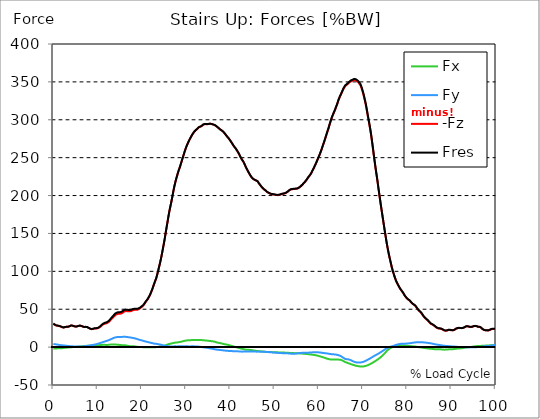
| Category |  Fx |  Fy |  -Fz |  Fres |
|---|---|---|---|---|
| 0.0 | -1.701 | 4.159 | 30.864 | 31.217 |
| 0.167348456675344 | -1.748 | 3.971 | 30.072 | 30.416 |
| 0.334696913350688 | -1.791 | 3.788 | 29.302 | 29.637 |
| 0.5020453700260321 | -1.786 | 3.659 | 28.735 | 29.063 |
| 0.669393826701376 | -1.757 | 3.547 | 28.417 | 28.736 |
| 0.83674228337672 | -1.702 | 3.41 | 28.226 | 28.524 |
| 1.0040907400520642 | -1.615 | 3.24 | 28.094 | 28.367 |
| 1.1621420602454444 | -1.544 | 3.049 | 27.975 | 28.224 |
| 1.3294905169207885 | -1.519 | 2.875 | 27.767 | 27.999 |
| 1.4968389735961325 | -1.509 | 2.706 | 27.473 | 27.695 |
| 1.6641874302714765 | -1.5 | 2.566 | 27.1 | 27.311 |
| 1.8315358869468206 | -1.456 | 2.451 | 26.69 | 26.891 |
| 1.9988843436221646 | -1.361 | 2.354 | 26.214 | 26.409 |
| 2.1662328002975086 | -1.263 | 2.255 | 25.83 | 26.015 |
| 2.333581256972853 | -1.145 | 2.162 | 25.814 | 25.984 |
| 2.5009297136481967 | -0.973 | 2.081 | 26.044 | 26.199 |
| 2.6682781703235405 | -0.799 | 1.96 | 26.397 | 26.531 |
| 2.8356266269988843 | -0.702 | 1.814 | 26.72 | 26.839 |
| 3.002975083674229 | -0.681 | 1.701 | 26.82 | 26.934 |
| 3.1703235403495724 | -0.642 | 1.596 | 26.796 | 26.907 |
| 3.337671997024917 | -0.572 | 1.503 | 26.77 | 26.873 |
| 3.4957233172182973 | -0.442 | 1.407 | 27.134 | 27.23 |
| 3.663071773893641 | -0.342 | 1.307 | 27.553 | 27.64 |
| 3.8304202305689854 | -0.218 | 1.198 | 28.1 | 28.183 |
| 3.997768687244329 | -0.108 | 1.105 | 28.513 | 28.593 |
| 4.165117143919673 | -0.037 | 1.041 | 28.532 | 28.609 |
| 4.332465600595017 | 0.003 | 0.99 | 28.264 | 28.339 |
| 4.499814057270361 | 0.024 | 0.953 | 27.959 | 28.032 |
| 4.667162513945706 | 0.032 | 0.92 | 27.556 | 27.63 |
| 4.834510970621049 | 0.06 | 0.891 | 27.208 | 27.283 |
| 5.001859427296393 | 0.161 | 0.863 | 27.097 | 27.174 |
| 5.169207883971737 | 0.299 | 0.838 | 27.121 | 27.198 |
| 5.336556340647081 | 0.417 | 0.813 | 27.276 | 27.354 |
| 5.503904797322425 | 0.527 | 0.776 | 27.547 | 27.625 |
| 5.671253253997769 | 0.619 | 0.737 | 27.889 | 27.968 |
| 5.82930457419115 | 0.708 | 0.696 | 28.248 | 28.324 |
| 5.996653030866494 | 0.76 | 0.689 | 28.344 | 28.42 |
| 6.164001487541838 | 0.811 | 0.726 | 28.15 | 28.229 |
| 6.331349944217181 | 0.855 | 0.764 | 27.864 | 27.944 |
| 6.498698400892526 | 0.951 | 0.823 | 27.496 | 27.577 |
| 6.66604685756787 | 1.072 | 0.919 | 27.046 | 27.131 |
| 6.833395314243213 | 1.178 | 0.999 | 26.693 | 26.786 |
| 7.000743770918558 | 1.302 | 1.075 | 26.512 | 26.611 |
| 7.168092227593902 | 1.447 | 1.162 | 26.571 | 26.678 |
| 7.335440684269246 | 1.577 | 1.245 | 26.678 | 26.794 |
| 7.50278914094459 | 1.67 | 1.351 | 26.597 | 26.723 |
| 7.6701375976199335 | 1.729 | 1.521 | 26.308 | 26.445 |
| 7.837486054295278 | 1.764 | 1.678 | 25.869 | 26.021 |
| 7.995537374488658 | 1.795 | 1.876 | 25.202 | 25.37 |
| 8.162885831164003 | 1.83 | 2.09 | 24.496 | 24.683 |
| 8.330234287839346 | 1.881 | 2.286 | 24.118 | 24.329 |
| 8.49758274451469 | 1.948 | 2.465 | 23.77 | 24.006 |
| 8.664931201190035 | 2.032 | 2.631 | 23.577 | 23.839 |
| 8.832279657865378 | 2.134 | 2.807 | 23.723 | 24.009 |
| 8.999628114540721 | 2.209 | 2.982 | 23.978 | 24.286 |
| 9.166976571216066 | 2.27 | 3.162 | 24.324 | 24.655 |
| 9.334325027891412 | 2.276 | 3.333 | 24.603 | 24.951 |
| 9.501673484566755 | 2.236 | 3.501 | 24.622 | 24.99 |
| 9.669021941242098 | 2.242 | 3.757 | 24.631 | 25.038 |
| 9.836370397917442 | 2.249 | 4.01 | 24.64 | 25.087 |
| 10.003718854592787 | 2.299 | 4.307 | 24.746 | 25.246 |
| 10.17106731126813 | 2.431 | 4.602 | 25.125 | 25.681 |
| 10.329118631461512 | 2.556 | 4.895 | 25.708 | 26.317 |
| 10.496467088136853 | 2.68 | 5.19 | 26.342 | 27 |
| 10.663815544812199 | 2.782 | 5.519 | 27.131 | 27.844 |
| 10.831164001487544 | 2.861 | 5.867 | 28.06 | 28.827 |
| 10.998512458162887 | 2.937 | 6.209 | 28.972 | 29.794 |
| 11.16586091483823 | 2.979 | 6.525 | 29.676 | 30.547 |
| 11.333209371513574 | 2.972 | 6.844 | 30.258 | 31.184 |
| 11.50055782818892 | 2.962 | 7.156 | 30.692 | 31.676 |
| 11.667906284864264 | 2.966 | 7.538 | 31.038 | 32.097 |
| 11.835254741539607 | 2.917 | 7.829 | 31.28 | 32.397 |
| 12.00260319821495 | 2.869 | 8.078 | 31.515 | 32.683 |
| 12.169951654890292 | 2.851 | 8.375 | 31.819 | 33.05 |
| 12.337300111565641 | 2.931 | 8.764 | 32.361 | 33.676 |
| 12.504648568240984 | 3.029 | 9.136 | 33.032 | 34.425 |
| 12.662699888434362 | 3.149 | 9.5 | 33.914 | 35.376 |
| 12.830048345109708 | 3.286 | 9.888 | 34.969 | 36.503 |
| 12.997396801785053 | 3.389 | 10.413 | 36.204 | 37.836 |
| 13.164745258460396 | 3.487 | 10.906 | 37.274 | 39.004 |
| 13.33209371513574 | 3.522 | 11.296 | 38.198 | 39.999 |
| 13.499442171811083 | 3.509 | 11.72 | 39.15 | 41.027 |
| 13.666790628486426 | 3.499 | 12.127 | 40.313 | 42.251 |
| 13.834139085161771 | 3.475 | 12.516 | 41.44 | 43.437 |
| 14.001487541837117 | 3.378 | 12.794 | 42.301 | 44.33 |
| 14.16883599851246 | 3.319 | 13.001 | 42.883 | 44.941 |
| 14.336184455187803 | 3.251 | 13.177 | 43.375 | 45.454 |
| 14.503532911863147 | 3.187 | 13.282 | 43.721 | 45.813 |
| 14.670881368538492 | 3.108 | 13.339 | 43.941 | 46.037 |
| 14.828932688731873 | 2.966 | 13.336 | 43.968 | 46.058 |
| 14.996281145407215 | 2.832 | 13.335 | 43.973 | 46.059 |
| 15.163629602082558 | 2.696 | 13.333 | 43.979 | 46.06 |
| 15.330978058757903 | 2.636 | 13.37 | 44.286 | 46.361 |
| 15.498326515433247 | 2.606 | 13.456 | 44.749 | 46.826 |
| 15.665674972108594 | 2.577 | 13.516 | 45.381 | 47.444 |
| 15.833023428783937 | 2.552 | 13.59 | 46.176 | 48.224 |
| 16.00037188545928 | 2.496 | 13.628 | 46.889 | 48.914 |
| 16.167720342134626 | 2.41 | 13.611 | 47.372 | 49.366 |
| 16.335068798809967 | 2.282 | 13.544 | 47.535 | 49.5 |
| 16.502417255485312 | 2.086 | 13.447 | 47.58 | 49.509 |
| 16.669765712160658 | 1.892 | 13.32 | 47.471 | 49.364 |
| 16.837114168836 | 1.674 | 13.177 | 47.288 | 49.149 |
| 17.004462625511344 | 1.481 | 13.062 | 47.167 | 49.003 |
| 17.16251394570472 | 1.286 | 12.923 | 47.121 | 48.926 |
| 17.32986240238007 | 1.128 | 12.761 | 47.218 | 48.979 |
| 17.497210859055414 | 1.072 | 12.599 | 47.503 | 49.215 |
| 17.664559315730756 | 1.009 | 12.438 | 47.816 | 49.482 |
| 17.8319077724061 | 1.032 | 12.258 | 48.257 | 49.867 |
| 17.999256229081443 | 1.062 | 12.074 | 48.665 | 50.221 |
| 18.166604685756788 | 1.053 | 11.876 | 49 | 50.501 |
| 18.333953142432133 | 0.973 | 11.652 | 49.217 | 50.661 |
| 18.501301599107478 | 0.823 | 11.407 | 49.242 | 50.633 |
| 18.668650055782823 | 0.64 | 11.136 | 49.217 | 50.546 |
| 18.835998512458165 | 0.456 | 10.847 | 49.178 | 50.441 |
| 19.00334696913351 | 0.351 | 10.563 | 49.355 | 50.556 |
| 19.170695425808855 | 0.291 | 10.211 | 49.745 | 50.864 |
| 19.338043882484197 | 0.252 | 9.912 | 50.252 | 51.299 |
| 19.496095202677576 | 0.214 | 9.656 | 50.879 | 51.872 |
| 19.66344365935292 | 0.153 | 9.413 | 51.485 | 52.435 |
| 19.830792116028263 | 0.102 | 9.124 | 52.348 | 53.236 |
| 19.998140572703612 | 0.053 | 8.851 | 53.155 | 53.996 |
| 20.165489029378953 | -0.013 | 8.58 | 53.917 | 54.72 |
| 20.3328374860543 | -0.099 | 8.291 | 54.869 | 55.621 |
| 20.500185942729644 | -0.164 | 7.984 | 56.198 | 56.888 |
| 20.667534399404985 | -0.209 | 7.68 | 57.625 | 58.254 |
| 20.83488285608033 | -0.183 | 7.373 | 59.181 | 59.758 |
| 21.002231312755672 | -0.198 | 7.158 | 60.581 | 61.139 |
| 21.16957976943102 | -0.245 | 6.982 | 61.695 | 62.24 |
| 21.336928226106362 | -0.264 | 6.752 | 63.093 | 63.609 |
| 21.504276682781704 | -0.237 | 6.465 | 64.937 | 65.409 |
| 21.67162513945705 | -0.236 | 6.251 | 66.711 | 67.158 |
| 21.82967645965043 | -0.242 | 6.049 | 68.434 | 68.855 |
| 21.997024916325774 | -0.192 | 5.724 | 70.839 | 71.215 |
| 22.16437337300112 | -0.221 | 5.515 | 73.236 | 73.597 |
| 22.33172182967646 | -0.243 | 5.323 | 75.552 | 75.898 |
| 22.499070286351806 | -0.18 | 5.022 | 78.416 | 78.721 |
| 22.666418743027148 | -0.136 | 4.752 | 81.322 | 81.591 |
| 22.833767199702496 | -0.097 | 4.572 | 84.153 | 84.406 |
| 23.00111565637784 | -0.059 | 4.451 | 86.813 | 87.052 |
| 23.168464113053183 | -0.022 | 4.364 | 89.378 | 89.603 |
| 23.335812569728528 | 0.015 | 4.32 | 92.311 | 92.524 |
| 23.50316102640387 | 0.081 | 4.127 | 96.068 | 96.26 |
| 23.670509483079215 | 0.223 | 3.873 | 100.06 | 100.229 |
| 23.83785793975456 | 0.413 | 3.649 | 104.06 | 104.209 |
| 23.995909259947936 | 0.683 | 3.507 | 108.05 | 108.189 |
| 24.163257716623285 | 0.878 | 3.354 | 112.178 | 112.308 |
| 24.330606173298627 | 1.012 | 3.125 | 116.729 | 116.847 |
| 24.49795462997397 | 1.127 | 2.898 | 121.466 | 121.574 |
| 24.665303086649313 | 1.308 | 2.624 | 126.622 | 126.72 |
| 24.83265154332466 | 1.507 | 2.332 | 131.935 | 132.024 |
| 25.0 | 1.727 | 2.13 | 137.078 | 137.161 |
| 25.167348456675345 | 1.975 | 1.95 | 142.562 | 142.645 |
| 25.334696913350694 | 2.304 | 1.765 | 148.633 | 148.717 |
| 25.502045370026035 | 2.671 | 1.618 | 154.431 | 154.519 |
| 25.669393826701377 | 3.043 | 1.524 | 160.299 | 160.395 |
| 25.836742283376722 | 3.363 | 1.425 | 165.783 | 165.888 |
| 26.004090740052067 | 3.777 | 1.235 | 171.835 | 171.948 |
| 26.17143919672741 | 4.106 | 1.059 | 177.271 | 177.394 |
| 26.329490516920792 | 4.363 | 0.957 | 182.208 | 182.338 |
| 26.49683897359613 | 4.5 | 0.894 | 186.755 | 186.886 |
| 26.66418743027148 | 4.696 | 0.861 | 191.376 | 191.513 |
| 26.831535886946828 | 4.971 | 0.839 | 196.316 | 196.46 |
| 26.998884343622166 | 5.215 | 0.866 | 201.406 | 201.558 |
| 27.166232800297514 | 5.437 | 0.942 | 206.667 | 206.823 |
| 27.333581256972852 | 5.65 | 0.996 | 211.45 | 211.611 |
| 27.5009297136482 | 5.816 | 0.994 | 215.617 | 215.78 |
| 27.668278170323543 | 5.963 | 0.976 | 219.624 | 219.791 |
| 27.835626626998888 | 6.083 | 0.953 | 223.14 | 223.307 |
| 28.002975083674233 | 6.22 | 0.953 | 226.493 | 226.661 |
| 28.170323540349575 | 6.364 | 0.981 | 229.926 | 230.096 |
| 28.33767199702492 | 6.516 | 1.056 | 232.991 | 233.159 |
| 28.50502045370026 | 6.667 | 1.147 | 235.72 | 235.885 |
| 28.663071773893645 | 6.838 | 1.239 | 238.625 | 238.789 |
| 28.830420230568986 | 7.013 | 1.274 | 241.794 | 241.957 |
| 28.99776868724433 | 7.257 | 1.18 | 245.04 | 245.204 |
| 29.165117143919673 | 7.521 | 1.069 | 248.233 | 248.395 |
| 29.33246560059502 | 7.794 | 0.975 | 251.336 | 251.499 |
| 29.499814057270367 | 8.062 | 0.898 | 254.438 | 254.602 |
| 29.66716251394571 | 8.267 | 1.001 | 257.619 | 257.786 |
| 29.834510970621054 | 8.524 | 1.021 | 260.491 | 260.661 |
| 30.00185942729639 | 8.674 | 1.059 | 263.232 | 263.403 |
| 30.169207883971744 | 8.791 | 1.058 | 265.78 | 265.953 |
| 30.33655634064708 | 8.916 | 0.999 | 268.056 | 268.23 |
| 30.50390479732243 | 9.003 | 0.985 | 270.215 | 270.391 |
| 30.671253253997772 | 9.035 | 0.956 | 272.314 | 272.488 |
| 30.829304574191156 | 9.099 | 0.916 | 274.221 | 274.397 |
| 30.996653030866494 | 9.18 | 0.945 | 276.041 | 276.217 |
| 31.164001487541842 | 9.257 | 1.015 | 277.835 | 278.012 |
| 31.331349944217187 | 9.276 | 1.075 | 279.56 | 279.736 |
| 31.498698400892525 | 9.267 | 1.112 | 281.217 | 281.391 |
| 31.666046857567874 | 9.32 | 1.032 | 282.64 | 282.814 |
| 31.833395314243212 | 9.335 | 0.971 | 283.99 | 284.164 |
| 32.00074377091856 | 9.294 | 0.932 | 285.119 | 285.291 |
| 32.1680922275939 | 9.283 | 0.875 | 286.096 | 286.265 |
| 32.33544068426925 | 9.316 | 0.83 | 286.953 | 287.122 |
| 32.50278914094459 | 9.404 | 0.776 | 287.748 | 287.92 |
| 32.670137597619934 | 9.444 | 0.72 | 288.782 | 288.956 |
| 32.83748605429528 | 9.307 | 0.664 | 289.823 | 289.99 |
| 33.004834510970625 | 9.239 | 0.571 | 290.385 | 290.549 |
| 33.162885831164004 | 9.243 | 0.44 | 290.757 | 290.92 |
| 33.33023428783935 | 9.265 | 0.308 | 291.069 | 291.233 |
| 33.497582744514695 | 9.239 | 0.174 | 291.575 | 291.737 |
| 33.664931201190036 | 9.212 | -0.006 | 292.546 | 292.706 |
| 33.83227965786538 | 9.167 | -0.156 | 293.447 | 293.605 |
| 33.99962811454073 | 9.031 | -0.263 | 294.012 | 294.165 |
| 34.16697657121607 | 8.907 | -0.414 | 294.236 | 294.385 |
| 34.33432502789141 | 8.799 | -0.574 | 294.35 | 294.497 |
| 34.50167348456676 | 8.723 | -0.712 | 294.277 | 294.422 |
| 34.6690219412421 | 8.652 | -0.85 | 294.17 | 294.314 |
| 34.83637039791744 | 8.562 | -0.982 | 294.15 | 294.292 |
| 35.00371885459279 | 8.431 | -1.137 | 294.301 | 294.44 |
| 35.17106731126814 | 8.28 | -1.336 | 294.565 | 294.702 |
| 35.338415767943474 | 8.136 | -1.527 | 294.786 | 294.919 |
| 35.49646708813686 | 8.01 | -1.689 | 294.763 | 294.894 |
| 35.6638155448122 | 7.904 | -1.857 | 294.591 | 294.721 |
| 35.831164001487544 | 7.814 | -2.059 | 294.233 | 294.363 |
| 35.998512458162885 | 7.711 | -2.267 | 293.81 | 293.94 |
| 36.165860914838234 | 7.519 | -2.454 | 293.645 | 293.773 |
| 36.333209371513576 | 7.32 | -2.645 | 293.482 | 293.608 |
| 36.50055782818892 | 7.044 | -2.822 | 292.923 | 293.044 |
| 36.667906284864266 | 6.755 | -3.034 | 292.332 | 292.45 |
| 36.83525474153961 | 6.468 | -3.204 | 291.572 | 291.687 |
| 37.002603198214956 | 6.15 | -3.332 | 290.718 | 290.827 |
| 37.1699516548903 | 5.895 | -3.445 | 289.971 | 290.08 |
| 37.337300111565646 | 5.655 | -3.547 | 289.195 | 289.301 |
| 37.50464856824098 | 5.444 | -3.612 | 288.35 | 288.456 |
| 37.66269988843437 | 5.289 | -3.736 | 287.509 | 287.614 |
| 37.83004834510971 | 5.125 | -3.848 | 286.677 | 286.782 |
| 37.99739680178505 | 4.897 | -3.963 | 286.072 | 286.174 |
| 38.16474525846039 | 4.646 | -4.102 | 285.472 | 285.569 |
| 38.33209371513574 | 4.357 | -4.22 | 284.572 | 284.668 |
| 38.49944217181109 | 4.1 | -4.335 | 283.63 | 283.724 |
| 38.666790628486424 | 3.866 | -4.479 | 282.609 | 282.702 |
| 38.83413908516178 | 3.674 | -4.611 | 281.35 | 281.442 |
| 39.001487541837115 | 3.547 | -4.726 | 279.973 | 280.068 |
| 39.16883599851246 | 3.376 | -4.807 | 278.67 | 278.761 |
| 39.336184455187805 | 3.17 | -4.894 | 277.556 | 277.646 |
| 39.503532911863154 | 2.945 | -4.951 | 276.497 | 276.586 |
| 39.670881368538495 | 2.684 | -5.035 | 275.263 | 275.35 |
| 39.83822982521384 | 2.395 | -5.117 | 273.863 | 273.948 |
| 39.996281145407224 | 2.1 | -5.178 | 272.456 | 272.541 |
| 40.163629602082565 | 1.804 | -5.221 | 271.022 | 271.105 |
| 40.33097805875791 | 1.532 | -5.26 | 269.532 | 269.615 |
| 40.498326515433256 | 1.255 | -5.307 | 268.024 | 268.108 |
| 40.6656749721086 | 0.978 | -5.358 | 266.484 | 266.566 |
| 40.83302342878393 | 0.709 | -5.412 | 264.928 | 265.012 |
| 41.00037188545929 | 0.414 | -5.469 | 263.792 | 263.876 |
| 41.16772034213463 | 0.125 | -5.522 | 262.608 | 262.692 |
| 41.33506879880997 | -0.143 | -5.546 | 261.167 | 261.251 |
| 41.50241725548531 | -0.419 | -5.556 | 259.594 | 259.68 |
| 41.66976571216066 | -0.687 | -5.575 | 258.027 | 258.114 |
| 41.837114168836 | -0.947 | -5.605 | 256.441 | 256.529 |
| 42.004462625511344 | -1.242 | -5.664 | 254.662 | 254.754 |
| 42.17181108218669 | -1.552 | -5.786 | 252.584 | 252.68 |
| 42.32986240238007 | -1.799 | -5.878 | 250.647 | 250.749 |
| 42.497210859055414 | -2.003 | -5.934 | 248.788 | 248.894 |
| 42.66455931573076 | -2.189 | -5.99 | 247.246 | 247.355 |
| 42.831907772406105 | -2.447 | -5.948 | 245.76 | 245.87 |
| 42.999256229081446 | -2.709 | -5.912 | 244.249 | 244.361 |
| 43.16660468575679 | -2.95 | -5.836 | 242.279 | 242.394 |
| 43.33395314243214 | -3.158 | -5.788 | 240.084 | 240.202 |
| 43.50130159910748 | -3.311 | -5.78 | 237.85 | 237.971 |
| 43.66865005578282 | -3.417 | -5.751 | 235.783 | 235.906 |
| 43.83599851245817 | -3.46 | -5.692 | 233.948 | 234.071 |
| 44.00334696913351 | -3.525 | -5.72 | 232.136 | 232.261 |
| 44.17069542580886 | -3.591 | -5.758 | 230.344 | 230.472 |
| 44.3380438824842 | -3.653 | -5.796 | 228.608 | 228.74 |
| 44.49609520267758 | -3.715 | -5.835 | 226.873 | 227.007 |
| 44.66344365935292 | -3.841 | -5.895 | 225.379 | 225.519 |
| 44.83079211602827 | -3.996 | -5.91 | 224.019 | 224.165 |
| 44.99814057270361 | -4.162 | -5.907 | 222.922 | 223.071 |
| 45.16548902937895 | -4.332 | -5.898 | 221.945 | 222.099 |
| 45.332837486054295 | -4.491 | -5.913 | 221.319 | 221.476 |
| 45.500185942729644 | -4.64 | -5.931 | 220.777 | 220.938 |
| 45.66753439940499 | -4.755 | -5.934 | 220.124 | 220.288 |
| 45.83488285608033 | -4.925 | -5.965 | 219.839 | 220.007 |
| 46.00223131275568 | -5.099 | -5.999 | 219.575 | 219.746 |
| 46.16957976943102 | -5.242 | -5.962 | 218.78 | 218.953 |
| 46.336928226106366 | -5.347 | -5.873 | 217.348 | 217.524 |
| 46.50427668278171 | -5.388 | -5.965 | 215.81 | 215.99 |
| 46.671625139457056 | -5.482 | -5.999 | 214.544 | 214.73 |
| 46.829676459650436 | -5.519 | -6.086 | 213.314 | 213.506 |
| 46.99702491632577 | -5.597 | -6.122 | 211.972 | 212.17 |
| 47.16437337300112 | -5.674 | -6.156 | 210.835 | 211.035 |
| 47.33172182967646 | -5.792 | -6.142 | 209.799 | 210.004 |
| 47.49907028635181 | -5.932 | -6.115 | 208.823 | 209.034 |
| 47.66641874302716 | -6.055 | -6.136 | 207.944 | 208.159 |
| 47.83376719970249 | -6.196 | -6.153 | 207.143 | 207.366 |
| 48.001115656377834 | -6.348 | -6.183 | 206.478 | 206.706 |
| 48.16846411305319 | -6.347 | -6.353 | 205.506 | 205.739 |
| 48.33581256972853 | -6.342 | -6.488 | 204.658 | 204.895 |
| 48.50316102640387 | -6.401 | -6.54 | 204.111 | 204.353 |
| 48.67050948307921 | -6.44 | -6.58 | 203.54 | 203.786 |
| 48.837857939754564 | -6.448 | -6.665 | 203.004 | 203.254 |
| 49.005206396429905 | -6.453 | -6.773 | 202.494 | 202.748 |
| 49.163257716623285 | -6.499 | -6.835 | 202.19 | 202.448 |
| 49.33060617329863 | -6.566 | -6.872 | 201.925 | 202.187 |
| 49.49795462997397 | -6.642 | -6.948 | 201.711 | 201.978 |
| 49.66530308664932 | -6.729 | -7.075 | 201.566 | 201.841 |
| 49.832651543324666 | -6.808 | -7.18 | 201.417 | 201.698 |
| 50.0 | -6.86 | -7.251 | 201.235 | 201.519 |
| 50.16734845667534 | -6.863 | -7.302 | 200.991 | 201.277 |
| 50.33469691335069 | -6.861 | -7.35 | 200.779 | 201.065 |
| 50.50204537002604 | -6.858 | -7.426 | 200.602 | 200.891 |
| 50.66939382670139 | -6.886 | -7.552 | 200.549 | 200.844 |
| 50.836742283376715 | -6.957 | -7.655 | 200.621 | 200.923 |
| 51.00409074005207 | -7.031 | -7.743 | 200.776 | 201.086 |
| 51.17143919672741 | -7.084 | -7.833 | 201.024 | 201.338 |
| 51.32949051692079 | -7.133 | -7.916 | 201.282 | 201.602 |
| 51.496838973596134 | -7.146 | -7.928 | 201.698 | 202.018 |
| 51.66418743027148 | -7.165 | -7.941 | 202.053 | 202.373 |
| 51.831535886946824 | -7.181 | -7.969 | 202.246 | 202.569 |
| 51.99888434362217 | -7.189 | -8.01 | 202.372 | 202.695 |
| 52.16623280029752 | -7.229 | -8.084 | 202.569 | 202.897 |
| 52.33358125697285 | -7.27 | -8.146 | 202.829 | 203.159 |
| 52.5009297136482 | -7.317 | -8.177 | 203.237 | 203.569 |
| 52.668278170323546 | -7.366 | -8.177 | 203.751 | 204.083 |
| 52.835626626998895 | -7.404 | -8.22 | 204.342 | 204.677 |
| 53.00297508367424 | -7.471 | -8.248 | 205.127 | 205.463 |
| 53.17032354034958 | -7.547 | -8.294 | 205.929 | 206.267 |
| 53.33767199702492 | -7.639 | -8.363 | 206.751 | 207.093 |
| 53.50502045370027 | -7.692 | -8.497 | 207.404 | 207.752 |
| 53.663071773893655 | -7.758 | -8.643 | 207.92 | 208.276 |
| 53.83042023056899 | -7.833 | -8.714 | 208.232 | 208.59 |
| 53.99776868724433 | -7.867 | -8.777 | 208.357 | 208.718 |
| 54.16511714391967 | -7.91 | -8.799 | 208.528 | 208.892 |
| 54.33246560059503 | -7.938 | -8.745 | 208.58 | 208.944 |
| 54.49981405727037 | -7.966 | -8.696 | 208.665 | 209.029 |
| 54.667162513945705 | -8.003 | -8.624 | 208.764 | 209.125 |
| 54.834510970621054 | -8.041 | -8.529 | 208.824 | 209.183 |
| 55.0018594272964 | -8.081 | -8.423 | 208.913 | 209.268 |
| 55.169207883971744 | -8.124 | -8.226 | 209.217 | 209.565 |
| 55.336556340647086 | -8.167 | -8.041 | 209.558 | 209.898 |
| 55.50390479732243 | -8.223 | -7.947 | 210.164 | 210.504 |
| 55.671253253997776 | -8.28 | -7.839 | 210.819 | 211.156 |
| 55.83860171067312 | -8.335 | -7.749 | 211.596 | 211.931 |
| 55.9966530308665 | -8.392 | -7.665 | 212.451 | 212.786 |
| 56.16400148754184 | -8.463 | -7.581 | 213.353 | 213.686 |
| 56.33134994421718 | -8.566 | -7.496 | 214.363 | 214.696 |
| 56.498698400892536 | -8.687 | -7.429 | 215.444 | 215.777 |
| 56.66604685756788 | -8.786 | -7.419 | 216.506 | 216.839 |
| 56.83339531424321 | -8.872 | -7.438 | 217.553 | 217.889 |
| 57.00074377091856 | -8.956 | -7.472 | 218.658 | 218.997 |
| 57.16809222759391 | -9.049 | -7.448 | 219.892 | 220.232 |
| 57.33544068426925 | -9.122 | -7.4 | 221.291 | 221.627 |
| 57.5027891409446 | -9.208 | -7.354 | 222.822 | 223.156 |
| 57.670137597619934 | -9.302 | -7.317 | 224.277 | 224.611 |
| 57.83748605429528 | -9.432 | -7.255 | 225.386 | 225.72 |
| 58.004834510970625 | -9.602 | -7.183 | 226.572 | 226.907 |
| 58.16288583116401 | -9.726 | -7.139 | 227.997 | 228.332 |
| 58.330234287839346 | -9.829 | -7.058 | 229.792 | 230.125 |
| 58.497582744514695 | -9.947 | -6.988 | 231.841 | 232.176 |
| 58.66493120119004 | -10.091 | -6.891 | 233.683 | 234.019 |
| 58.832279657865385 | -10.233 | -6.817 | 235.575 | 235.913 |
| 58.999628114540734 | -10.363 | -6.808 | 237.611 | 237.953 |
| 59.16697657121607 | -10.494 | -6.799 | 239.647 | 239.991 |
| 59.33432502789142 | -10.729 | -6.754 | 241.776 | 242.124 |
| 59.50167348456676 | -10.984 | -6.721 | 243.968 | 244.322 |
| 59.66902194124211 | -11.233 | -6.785 | 246.347 | 246.712 |
| 59.83637039791745 | -11.471 | -6.886 | 248.704 | 249.081 |
| 60.00371885459278 | -11.723 | -6.971 | 250.894 | 251.282 |
| 60.17106731126813 | -11.991 | -7.05 | 253.264 | 253.664 |
| 60.33841576794349 | -12.27 | -7.142 | 255.76 | 256.171 |
| 60.49646708813685 | -12.566 | -7.265 | 258.26 | 258.684 |
| 60.6638155448122 | -12.879 | -7.42 | 261.021 | 261.462 |
| 60.831164001487544 | -13.184 | -7.569 | 264.007 | 264.462 |
| 60.99851245816289 | -13.488 | -7.726 | 266.903 | 267.373 |
| 61.16586091483824 | -13.785 | -7.835 | 269.594 | 270.077 |
| 61.333209371513576 | -14.112 | -7.963 | 272.521 | 273.018 |
| 61.50055782818892 | -14.426 | -8.102 | 275.58 | 276.091 |
| 61.667906284864266 | -14.796 | -8.201 | 278.737 | 279.265 |
| 61.835254741539615 | -15.133 | -8.314 | 281.816 | 282.358 |
| 62.002603198214956 | -15.425 | -8.485 | 284.841 | 285.398 |
| 62.16995165489029 | -15.673 | -8.63 | 287.625 | 288.196 |
| 62.33730011156564 | -15.904 | -8.819 | 290.99 | 291.574 |
| 62.504648568240995 | -16.133 | -9.007 | 294.351 | 294.947 |
| 62.67199702491633 | -16.27 | -9.165 | 297.376 | 297.978 |
| 62.83004834510971 | -16.329 | -9.289 | 300.308 | 300.91 |
| 62.99739680178505 | -16.42 | -9.409 | 303.186 | 303.789 |
| 63.1647452584604 | -16.463 | -9.482 | 305.676 | 306.279 |
| 63.33209371513575 | -16.416 | -9.522 | 308.019 | 308.617 |
| 63.4994421718111 | -16.394 | -9.594 | 310.348 | 310.941 |
| 63.666790628486424 | -16.357 | -9.696 | 312.605 | 313.195 |
| 63.83413908516177 | -16.347 | -9.801 | 315.215 | 315.804 |
| 64.00148754183712 | -16.35 | -9.976 | 317.817 | 318.407 |
| 64.16883599851248 | -16.35 | -10.171 | 320.347 | 320.94 |
| 64.3361844551878 | -16.41 | -10.438 | 323.294 | 323.894 |
| 64.50353291186315 | -16.51 | -10.746 | 326.242 | 326.853 |
| 64.6708813685385 | -16.581 | -11.074 | 328.755 | 329.375 |
| 64.83822982521384 | -16.661 | -11.463 | 330.942 | 331.578 |
| 65.00557828188919 | -16.83 | -11.853 | 333.024 | 333.678 |
| 65.16362960208257 | -17.125 | -12.447 | 335.171 | 335.864 |
| 65.3309780587579 | -17.583 | -13.114 | 337.322 | 338.066 |
| 65.49832651543326 | -18.153 | -13.776 | 339.552 | 340.354 |
| 65.6656749721086 | -18.684 | -14.478 | 341.401 | 342.26 |
| 65.83302342878395 | -19.257 | -15.087 | 343.053 | 343.965 |
| 66.00037188545929 | -19.798 | -15.649 | 344.528 | 345.49 |
| 66.16772034213463 | -20.086 | -15.857 | 345.345 | 346.33 |
| 66.33506879880998 | -20.354 | -15.947 | 346.087 | 347.088 |
| 66.50241725548531 | -20.72 | -16.028 | 346.841 | 347.864 |
| 66.66976571216065 | -21.156 | -16.143 | 347.811 | 348.863 |
| 66.83711416883601 | -21.565 | -16.329 | 348.786 | 349.869 |
| 67.00446262551135 | -21.872 | -16.659 | 349.647 | 350.763 |
| 67.1718110821867 | -22.23 | -17.059 | 350.42 | 351.575 |
| 67.32986240238007 | -22.553 | -17.497 | 350.934 | 352.13 |
| 67.49721085905541 | -22.931 | -18.004 | 351.102 | 352.347 |
| 67.66455931573076 | -23.286 | -18.501 | 351.671 | 352.963 |
| 67.83190777240611 | -23.572 | -18.941 | 352.268 | 353.6 |
| 67.99925622908145 | -23.802 | -19.283 | 352.46 | 353.823 |
| 68.16660468575678 | -24.15 | -19.614 | 352.451 | 353.855 |
| 68.33395314243214 | -24.5 | -19.914 | 352.183 | 353.628 |
| 68.50130159910749 | -24.758 | -20.133 | 351.577 | 353.055 |
| 68.66865005578282 | -24.903 | -20.299 | 350.957 | 352.457 |
| 68.83599851245816 | -25.035 | -20.378 | 350.125 | 351.639 |
| 69.00334696913352 | -25.181 | -20.412 | 349.094 | 350.622 |
| 69.17069542580886 | -25.301 | -20.444 | 347.839 | 349.382 |
| 69.3380438824842 | -25.488 | -20.441 | 346.469 | 348.029 |
| 69.50539233915956 | -25.612 | -20.223 | 344.64 | 346.204 |
| 69.66344365935292 | -25.65 | -20.009 | 342.022 | 343.586 |
| 69.83079211602826 | -25.618 | -19.832 | 338.864 | 340.428 |
| 69.99814057270362 | -25.555 | -19.649 | 335.603 | 337.167 |
| 70.16548902937896 | -25.444 | -19.271 | 331.847 | 333.397 |
| 70.33283748605429 | -25.209 | -18.845 | 327.702 | 329.23 |
| 70.50018594272964 | -24.997 | -18.4 | 323.524 | 325.029 |
| 70.667534399405 | -24.792 | -17.95 | 318.903 | 320.386 |
| 70.83488285608033 | -24.479 | -17.441 | 313.658 | 315.115 |
| 71.00223131275568 | -24.096 | -16.886 | 308.103 | 309.525 |
| 71.16957976943102 | -23.661 | -16.342 | 302.549 | 303.932 |
| 71.33692822610637 | -23.221 | -15.842 | 297.246 | 298.593 |
| 71.50427668278171 | -22.771 | -15.363 | 292.009 | 293.316 |
| 71.67162513945706 | -22.327 | -14.811 | 286.304 | 287.572 |
| 71.8389735961324 | -21.848 | -14.201 | 280.025 | 281.252 |
| 71.99702491632577 | -21.304 | -13.572 | 273.201 | 274.382 |
| 72.16437337300113 | -20.687 | -12.965 | 265.783 | 266.92 |
| 72.33172182967647 | -20.08 | -12.357 | 258.313 | 259.404 |
| 72.49907028635181 | -19.479 | -11.805 | 250.81 | 251.858 |
| 72.66641874302715 | -18.891 | -11.28 | 243.55 | 244.558 |
| 72.8337671997025 | -18.285 | -10.726 | 236.578 | 237.543 |
| 73.00111565637783 | -17.647 | -10.199 | 229.791 | 230.708 |
| 73.16846411305319 | -16.985 | -9.673 | 223.484 | 224.351 |
| 73.33581256972853 | -16.326 | -9.139 | 216.553 | 217.372 |
| 73.50316102640387 | -15.647 | -8.6 | 209.382 | 210.153 |
| 73.67050948307921 | -14.891 | -8.013 | 202.549 | 203.264 |
| 73.83785793975457 | -14.081 | -7.434 | 195.742 | 196.4 |
| 74.00520639642991 | -13.31 | -6.785 | 188.947 | 189.546 |
| 74.16325771662328 | -12.521 | -6.147 | 182.383 | 182.926 |
| 74.33060617329863 | -11.605 | -5.509 | 176.035 | 176.513 |
| 74.49795462997398 | -10.678 | -4.869 | 169.678 | 170.094 |
| 74.66530308664932 | -9.715 | -4.221 | 163.27 | 163.625 |
| 74.83265154332466 | -8.699 | -3.538 | 156.866 | 157.161 |
| 75.00000000000001 | -7.649 | -2.916 | 150.857 | 151.097 |
| 75.16734845667534 | -6.532 | -2.24 | 144.714 | 144.898 |
| 75.3346969133507 | -5.403 | -1.583 | 138.619 | 138.752 |
| 75.50204537002605 | -4.479 | -1.086 | 133.274 | 133.37 |
| 75.66939382670138 | -3.586 | -0.631 | 127.984 | 128.05 |
| 75.83674228337672 | -2.768 | -0.236 | 123.189 | 123.237 |
| 76.00409074005208 | -2.034 | 0.119 | 118.646 | 118.678 |
| 76.17143919672742 | -1.45 | 0.417 | 114.434 | 114.456 |
| 76.33878765340276 | -0.922 | 0.684 | 110.142 | 110.161 |
| 76.49683897359614 | -0.41 | 0.944 | 105.903 | 105.919 |
| 76.66418743027148 | -0.015 | 1.205 | 102.196 | 102.215 |
| 76.83153588694682 | 0.357 | 1.485 | 98.851 | 98.875 |
| 76.99888434362218 | 0.673 | 1.841 | 95.785 | 95.819 |
| 77.16623280029752 | 0.991 | 2.192 | 92.701 | 92.745 |
| 77.33358125697285 | 1.339 | 2.594 | 89.9 | 89.959 |
| 77.5009297136482 | 1.637 | 2.95 | 87.33 | 87.407 |
| 77.66827817032356 | 1.842 | 3.202 | 85.291 | 85.381 |
| 77.83562662699889 | 1.981 | 3.44 | 83.323 | 83.426 |
| 78.00297508367423 | 1.981 | 3.643 | 81.46 | 81.574 |
| 78.17032354034959 | 1.999 | 3.863 | 79.606 | 79.733 |
| 78.33767199702493 | 2.093 | 4.108 | 77.853 | 77.999 |
| 78.50502045370027 | 2.217 | 4.305 | 76.361 | 76.522 |
| 78.67236891037561 | 2.258 | 4.404 | 74.988 | 75.159 |
| 78.83042023056899 | 2.254 | 4.454 | 73.656 | 73.833 |
| 78.99776868724433 | 2.24 | 4.507 | 72.403 | 72.584 |
| 79.16511714391969 | 2.147 | 4.497 | 70.85 | 71.032 |
| 79.33246560059503 | 2.001 | 4.484 | 69.029 | 69.212 |
| 79.49981405727036 | 1.867 | 4.535 | 67.527 | 67.712 |
| 79.66716251394571 | 1.83 | 4.578 | 66.36 | 66.55 |
| 79.83451097062107 | 1.763 | 4.661 | 65.066 | 65.268 |
| 80.00185942729641 | 1.674 | 4.78 | 63.866 | 64.083 |
| 80.16920788397174 | 1.6 | 4.864 | 63.099 | 63.322 |
| 80.33655634064709 | 1.546 | 4.937 | 62.487 | 62.715 |
| 80.50390479732243 | 1.479 | 5.029 | 61.782 | 62.019 |
| 80.67125325399778 | 1.388 | 5.173 | 60.779 | 61.032 |
| 80.83860171067312 | 1.277 | 5.333 | 59.525 | 59.796 |
| 80.99665303086651 | 1.184 | 5.506 | 58.35 | 58.64 |
| 81.16400148754184 | 1.094 | 5.667 | 57.381 | 57.686 |
| 81.3313499442172 | 0.994 | 5.785 | 56.653 | 56.972 |
| 81.49869840089255 | 0.907 | 5.917 | 56.029 | 56.363 |
| 81.66604685756786 | 0.824 | 6.06 | 55.423 | 55.771 |
| 81.83339531424322 | 0.726 | 6.202 | 54.549 | 54.916 |
| 82.00074377091858 | 0.583 | 6.323 | 53.214 | 53.605 |
| 82.16809222759392 | 0.401 | 6.395 | 51.763 | 52.176 |
| 82.33544068426926 | 0.205 | 6.426 | 50.341 | 50.77 |
| 82.50278914094459 | 0.04 | 6.438 | 49.049 | 49.49 |
| 82.67013759761994 | -0.097 | 6.432 | 47.916 | 48.366 |
| 82.83748605429528 | -0.206 | 6.459 | 47.072 | 47.531 |
| 83.00483451097062 | -0.323 | 6.469 | 46.245 | 46.712 |
| 83.17218296764597 | -0.471 | 6.462 | 45.196 | 45.673 |
| 83.33023428783935 | -0.636 | 6.413 | 43.826 | 44.311 |
| 83.4975827445147 | -0.795 | 6.316 | 42.276 | 42.773 |
| 83.66493120119004 | -0.993 | 6.251 | 40.857 | 41.366 |
| 83.83227965786537 | -1.173 | 6.139 | 39.631 | 40.143 |
| 83.99962811454073 | -1.295 | 6.037 | 38.519 | 39.034 |
| 84.16697657121607 | -1.386 | 5.948 | 37.593 | 38.109 |
| 84.33432502789142 | -1.504 | 5.822 | 36.712 | 37.226 |
| 84.50167348456677 | -1.639 | 5.702 | 35.925 | 36.434 |
| 84.6690219412421 | -1.774 | 5.584 | 35.14 | 35.646 |
| 84.83637039791745 | -1.934 | 5.459 | 34.052 | 34.559 |
| 85.0037188545928 | -2.063 | 5.316 | 32.817 | 33.326 |
| 85.17106731126813 | -2.173 | 5.146 | 31.68 | 32.186 |
| 85.33841576794349 | -2.257 | 4.973 | 30.85 | 31.345 |
| 85.50576422461883 | -2.313 | 4.78 | 30.332 | 30.81 |
| 85.66381554481221 | -2.363 | 4.572 | 29.898 | 30.354 |
| 85.83116400148755 | -2.445 | 4.369 | 29.394 | 29.833 |
| 85.99851245816289 | -2.581 | 4.127 | 28.695 | 29.124 |
| 86.16586091483823 | -2.737 | 3.895 | 27.925 | 28.348 |
| 86.33320937151358 | -2.858 | 3.678 | 27.114 | 27.532 |
| 86.50055782818893 | -2.928 | 3.5 | 26.289 | 26.708 |
| 86.66790628486427 | -2.972 | 3.327 | 25.587 | 25.999 |
| 86.83525474153961 | -2.985 | 3.195 | 25.056 | 25.462 |
| 87.00260319821496 | -2.985 | 3.056 | 24.711 | 25.105 |
| 87.16995165489031 | -2.968 | 2.897 | 24.556 | 24.931 |
| 87.33730011156564 | -2.94 | 2.751 | 24.454 | 24.813 |
| 87.504648568241 | -2.937 | 2.59 | 24.386 | 24.733 |
| 87.67199702491634 | -2.975 | 2.414 | 24.177 | 24.515 |
| 87.83004834510972 | -3.078 | 2.24 | 23.724 | 24.065 |
| 87.99739680178506 | -3.177 | 2.09 | 23.245 | 23.591 |
| 88.1647452584604 | -3.285 | 1.914 | 22.631 | 22.987 |
| 88.33209371513574 | -3.357 | 1.758 | 22.049 | 22.41 |
| 88.49944217181108 | -3.353 | 1.68 | 21.721 | 22.083 |
| 88.66679062848644 | -3.304 | 1.631 | 21.571 | 21.925 |
| 88.83413908516178 | -3.223 | 1.574 | 21.596 | 21.937 |
| 89.00148754183712 | -3.115 | 1.497 | 21.832 | 22.15 |
| 89.16883599851246 | -3.046 | 1.397 | 22.215 | 22.516 |
| 89.33618445518782 | -2.981 | 1.295 | 22.558 | 22.841 |
| 89.50353291186315 | -2.978 | 1.187 | 22.603 | 22.883 |
| 89.6708813685385 | -2.991 | 1.058 | 22.553 | 22.833 |
| 89.83822982521386 | -2.947 | 0.985 | 22.429 | 22.704 |
| 90.00557828188919 | -2.912 | 0.947 | 22.239 | 22.509 |
| 90.16362960208257 | -2.872 | 0.9 | 22.063 | 22.327 |
| 90.3309780587579 | -2.782 | 0.86 | 22.083 | 22.339 |
| 90.49832651543326 | -2.668 | 0.81 | 22.254 | 22.497 |
| 90.66567497210859 | -2.507 | 0.757 | 22.718 | 22.942 |
| 90.83302342878395 | -2.353 | 0.647 | 23.381 | 23.588 |
| 91.00037188545929 | -2.202 | 0.519 | 24.052 | 24.245 |
| 91.16772034213463 | -2.055 | 0.44 | 24.58 | 24.76 |
| 91.33506879880998 | -1.956 | 0.355 | 24.932 | 25.106 |
| 91.50241725548533 | -1.885 | 0.276 | 25.181 | 25.348 |
| 91.66976571216065 | -1.824 | 0.215 | 25.282 | 25.444 |
| 91.83711416883601 | -1.746 | 0.171 | 25.277 | 25.432 |
| 92.00446262551137 | -1.667 | 0.105 | 25.164 | 25.316 |
| 92.1718110821867 | -1.587 | 0.062 | 25.056 | 25.204 |
| 92.33915953886203 | -1.484 | 0.021 | 25.006 | 25.149 |
| 92.49721085905541 | -1.307 | 0.009 | 25.146 | 25.283 |
| 92.66455931573077 | -1.121 | 0.001 | 25.381 | 25.513 |
| 92.83190777240611 | -0.938 | -0.031 | 25.737 | 25.866 |
| 92.99925622908145 | -0.754 | -0.08 | 26.249 | 26.373 |
| 93.1666046857568 | -0.603 | -0.17 | 26.954 | 27.074 |
| 93.33395314243214 | -0.457 | -0.23 | 27.422 | 27.538 |
| 93.50130159910749 | -0.332 | -0.243 | 27.555 | 27.671 |
| 93.66865005578283 | -0.248 | -0.279 | 27.419 | 27.534 |
| 93.83599851245818 | -0.187 | -0.305 | 27.192 | 27.307 |
| 94.00334696913353 | -0.121 | -0.326 | 26.923 | 27.038 |
| 94.17069542580886 | -0.029 | -0.326 | 26.704 | 26.819 |
| 94.3380438824842 | 0.105 | -0.296 | 26.572 | 26.692 |
| 94.50539233915954 | 0.268 | -0.246 | 26.532 | 26.655 |
| 94.66344365935292 | 0.432 | -0.19 | 26.692 | 26.819 |
| 94.83079211602828 | 0.602 | -0.174 | 27.08 | 27.208 |
| 94.99814057270362 | 0.791 | -0.173 | 27.538 | 27.67 |
| 95.16548902937897 | 0.948 | -0.15 | 27.811 | 27.947 |
| 95.33283748605432 | 1.066 | -0.124 | 27.925 | 28.059 |
| 95.50018594272963 | 1.156 | -0.105 | 27.879 | 28.012 |
| 95.66753439940499 | 1.271 | -0.041 | 27.653 | 27.786 |
| 95.83488285608034 | 1.333 | 0.006 | 27.183 | 27.319 |
| 96.00223131275567 | 1.403 | 0.046 | 26.776 | 26.916 |
| 96.16957976943102 | 1.497 | 0.083 | 26.717 | 26.858 |
| 96.33692822610638 | 1.58 | 0.114 | 26.692 | 26.833 |
| 96.50427668278171 | 1.619 | 0.17 | 26.35 | 26.491 |
| 96.67162513945706 | 1.597 | 0.239 | 25.789 | 25.929 |
| 96.8389735961324 | 1.636 | 0.385 | 24.968 | 25.108 |
| 96.99702491632577 | 1.726 | 0.603 | 23.929 | 24.071 |
| 97.16437337300111 | 1.779 | 0.783 | 23.178 | 23.326 |
| 97.33172182967647 | 1.844 | 0.978 | 22.737 | 22.9 |
| 97.49907028635181 | 1.886 | 1.102 | 22.407 | 22.58 |
| 97.66641874302715 | 1.95 | 1.187 | 22.184 | 22.364 |
| 97.8337671997025 | 2.021 | 1.311 | 22.178 | 22.372 |
| 98.00111565637785 | 2.035 | 1.329 | 22.124 | 22.317 |
| 98.16846411305319 | 2.043 | 1.367 | 21.966 | 22.164 |
| 98.33581256972855 | 2.096 | 1.423 | 21.947 | 22.155 |
| 98.50316102640389 | 2.181 | 1.521 | 22.13 | 22.354 |
| 98.67050948307921 | 2.273 | 1.667 | 22.594 | 22.835 |
| 98.83785793975456 | 2.376 | 1.836 | 23.268 | 23.532 |
| 99.0052063964299 | 2.416 | 1.997 | 23.6 | 23.878 |
| 99.17255485310525 | 2.41 | 2.146 | 23.925 | 24.215 |
| 99.33060617329863 | 2.398 | 2.282 | 24.06 | 24.363 |
| 99.49795462997399 | 2.364 | 2.417 | 24.078 | 24.388 |
| 99.66530308664933 | 2.333 | 2.572 | 24.012 | 24.332 |
| 99.83265154332467 | 2.265 | 2.732 | 23.912 | 24.242 |
| 100.0 | 2.192 | 2.891 | 23.811 | 24.152 |